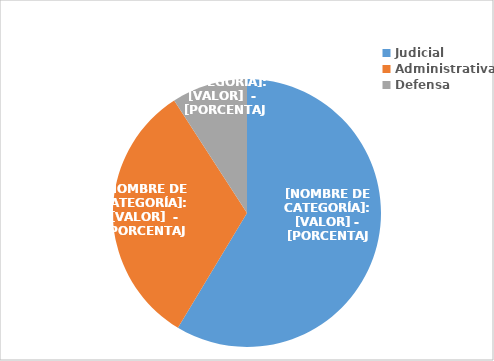
| Category | Series 0 |
|---|---|
| Judicial | 500 |
| Administrativa | 275 |
| Defensa | 78 |